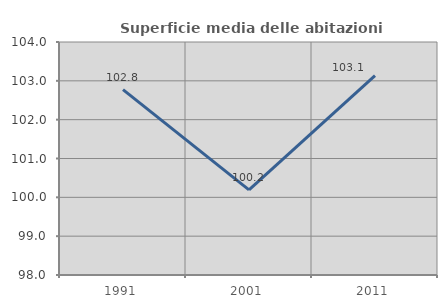
| Category | Superficie media delle abitazioni occupate |
|---|---|
| 1991.0 | 102.772 |
| 2001.0 | 100.192 |
| 2011.0 | 103.135 |